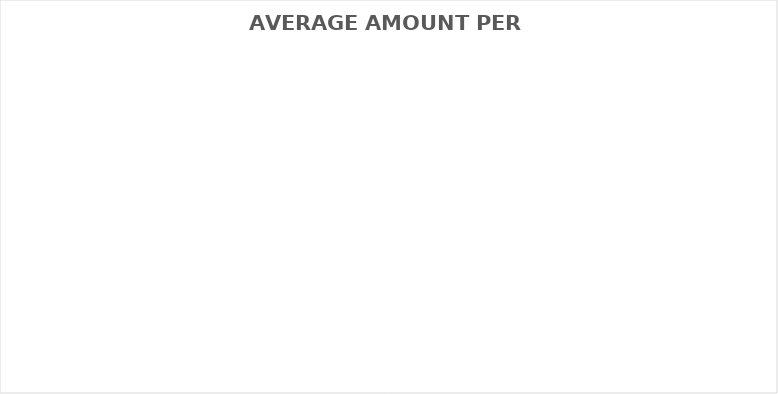
| Category | AVERAGE AMOUNT PER MONTH |
|---|---|
| HOUSING | 0 |
| UTILITIES | 0 |
| FOOD | 0 |
| INSURANCE | 0 |
| MEDICAL CARE | 0 |
| TRANSPORTATION | 0 |
| CHILD CARE | 0 |
| PERSONAL | 0 |
| ENTERTAINMENT | 0 |
| CHARITY | 0 |
| DEBT | 0 |
| SAVINGS | 0 |